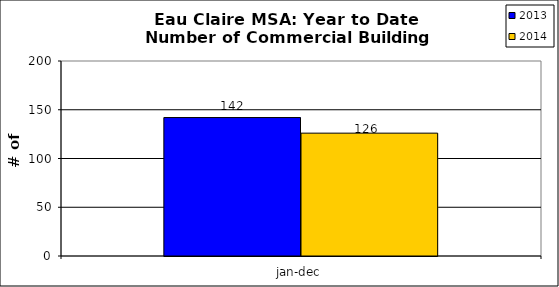
| Category | 2013 | 2014 |
|---|---|---|
| 0 | 142 | 126 |